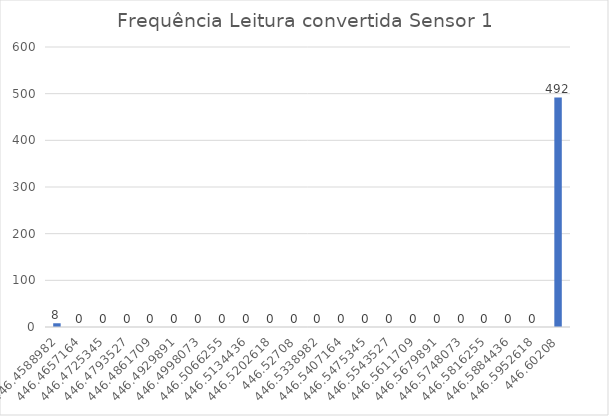
| Category | Series 0 |
|---|---|
| 446.4588981818182 | 8 |
| 446.4657163636364 | 0 |
| 446.47253454545455 | 0 |
| 446.4793527272727 | 0 |
| 446.4861709090909 | 0 |
| 446.49298909090913 | 0 |
| 446.4998072727273 | 0 |
| 446.5066254545455 | 0 |
| 446.51344363636366 | 0 |
| 446.52026181818184 | 0 |
| 446.52708 | 0 |
| 446.5338981818182 | 0 |
| 446.54071636363636 | 0 |
| 446.54753454545454 | 0 |
| 446.5543527272727 | 0 |
| 446.5611709090909 | 0 |
| 446.5679890909091 | 0 |
| 446.5748072727273 | 0 |
| 446.5816254545455 | 0 |
| 446.58844363636365 | 0 |
| 446.5952618181818 | 0 |
| 446.60208 | 492 |